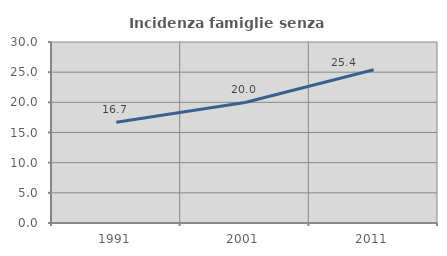
| Category | Incidenza famiglie senza nuclei |
|---|---|
| 1991.0 | 16.696 |
| 2001.0 | 19.975 |
| 2011.0 | 25.404 |